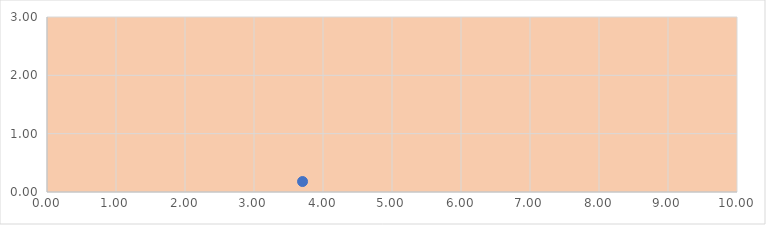
| Category | Series 0 |
|---|---|
| 3.7036902191325334 | 0.179 |